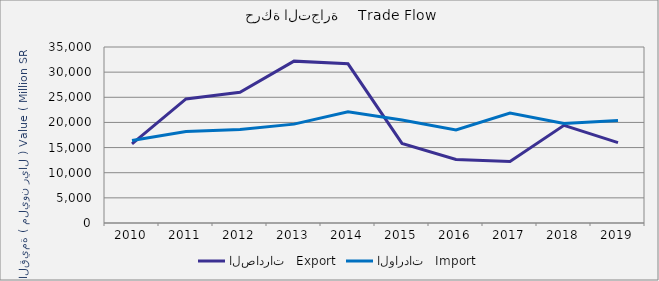
| Category | الصادرات   Export | الواردات   Import |
|---|---|---|
| 2010.0 | 15739413896 | 16394735147 |
| 2011.0 | 24678839499 | 18178155874 |
| 2012.0 | 26001699563 | 18603066629 |
| 2013.0 | 32190632584 | 19662716358 |
| 2014.0 | 31662285778 | 22132198691 |
| 2015.0 | 15836774971 | 20462340663 |
| 2016.0 | 12634665562 | 18507197079 |
| 2017.0 | 12247077878 | 21853435846 |
| 2018.0 | 19418996873 | 19777344467 |
| 2019.0 | 15969826202 | 20374684451 |